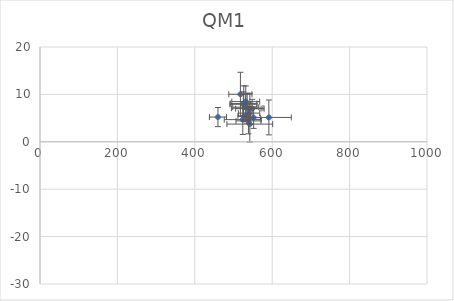
| Category | QM1 |
|---|---|
| 523.9843687172348 | 4.68 |
| 517.8852482547985 | 10.023 |
| 542.1349843945604 | 3.735 |
| 531.6552723284541 | 8.485 |
| 591.3550912594128 | 5.14 |
| 535.3544896740988 | 7.085 |
| 525.3604773971228 | 7.913 |
| 538.6664958344862 | 4.413 |
| 526.4061314720468 | 8.067 |
| 542.3264839523789 | 6.99 |
| 531.747656990036 | 7.308 |
| 459.84116465151374 | 5.219 |
| 540.0999717238944 | 6.054 |
| 548.2304422606368 | 6.998 |
| 552.0237386531406 | 5.093 |
| 527.9294705122958 | 5.464 |